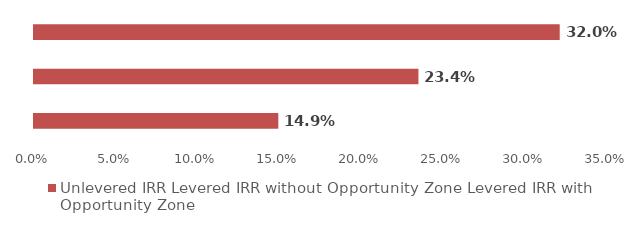
| Category | Unlevered IRR |
|---|---|
| 0 | 0.149 |
| 1 | 0.234 |
| 2 | 0.32 |